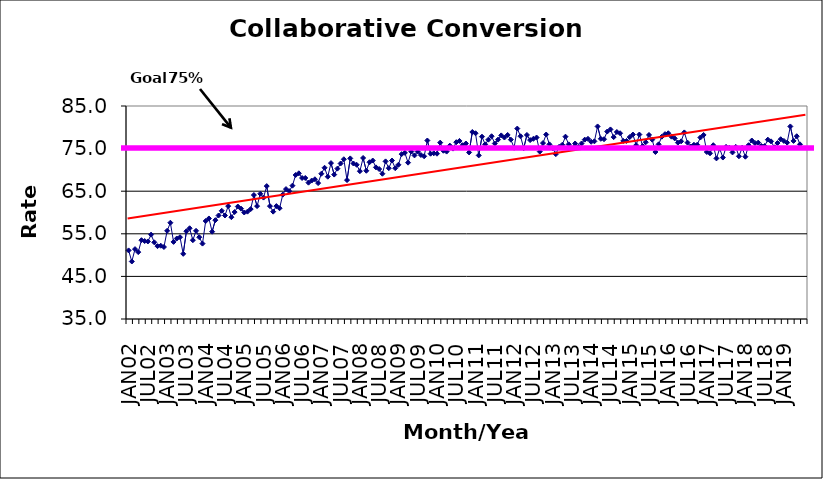
| Category | Series 0 |
|---|---|
| JAN02 | 51.1 |
| FEB02 | 48.5 |
| MAR02 | 51.4 |
| APR02 | 50.7 |
| MAY02 | 53.5 |
| JUN02 | 53.3 |
| JUL02 | 53.2 |
| AUG02 | 54.8 |
| SEP02 | 53 |
| OCT02 | 52.1 |
| NOV02 | 52.2 |
| DEC02 | 51.9 |
| JAN03 | 55.7 |
| FEB03 | 57.6 |
| MAR03 | 53.1 |
| APR03 | 53.9 |
| MAY03 | 54.2 |
| JUN03 | 50.3 |
| JUL03 | 55.6 |
| AUG03 | 56.3 |
| SEP03 | 53.5 |
| OCT03 | 55.7 |
| NOV03 | 54.2 |
| DEC03 | 52.7 |
| JAN04 | 58 |
| FEB04 | 58.6 |
| MAR04 | 55.5 |
| APR04 | 58.2 |
| MAY04 | 59.3 |
| JUN04 | 60.4 |
| JUL04 | 59.3 |
| AUG04 | 61.5 |
| SEP04 | 58.9 |
| OCT04 | 60.1 |
| NOV04 | 61.4 |
| DEC04 | 60.9 |
| JAN05 | 60 |
| FEB05 | 60.2 |
| MAR05 | 60.8 |
| APR05 | 64.1 |
| MAY05 | 61.5 |
| JUN05 | 64.4 |
| JUL05 | 63.5 |
| AUG05 | 66.2 |
| SEP05 | 61.5 |
| OCT05 | 60.2 |
| NOV05 | 61.5 |
| DEC05 | 61 |
| JAN06 | 64.2 |
| FEB06 | 65.5 |
| MAR06 | 65 |
| APR06 | 66.3 |
| MAY06 | 68.8 |
| JUN06 | 69.2 |
| JUL06 | 68.1 |
| AUG06 | 68.1 |
| SEP06 | 67 |
| OCT06 | 67.5 |
| NOV06 | 67.8 |
| DEC06 | 66.9 |
| JAN07 | 69.1 |
| FEB07 | 70.5 |
| MAR07 | 68.4 |
| APR07 | 71.6 |
| MAY07 | 68.9 |
| JUN07 | 70.3 |
| JUL07 | 71.5 |
| AUG07 | 72.5 |
| SEP07 | 67.6 |
| OCT07 | 72.7 |
| NOV07 | 71.5 |
| DEC07 | 71.2 |
| JAN08 | 69.7 |
| FEB08 | 72.8 |
| MAR08 | 69.8 |
| APR08 | 71.8 |
| MAY08 | 72.2 |
| JUN08 | 70.6 |
| JUL08 | 70.2 |
| AUG08 | 69.1 |
| SEP08 | 72 |
| OCT08 | 70.4 |
| NOV08 | 72.2 |
| DEC08 | 70.4 |
| JAN09 | 71.2 |
| FEB09 | 73.7 |
| MAR09 | 74 |
| APR09 | 71.7 |
| MAY09 | 74.3 |
| JUN09 | 73.4 |
| JUL09 | 74.3 |
| AUG09 | 73.5 |
| SEP09 | 73.2 |
| OCT09 | 76.9 |
| NOV09 | 73.8 |
| DEC09 | 73.9 |
| JAN10 | 73.8 |
| FEB10 | 76.4 |
| MAR10 | 74.5 |
| APR10 | 74.3 |
| MAY10 | 75.7 |
| JUN10 | 75 |
| JUL10 | 76.5 |
| AUG10 | 76.8 |
| SEP10 | 75.8 |
| OCT10 | 76.2 |
| NOV10 | 74.1 |
| DEC10 | 78.9 |
| JAN11 | 78.6 |
| FEB11 | 73.4 |
| MAR11 | 77.8 |
| APR11 | 76 |
| MAY11 | 77.1 |
| JUN11 | 77.9 |
| JUL11 | 76.2 |
| AUG11 | 77.1 |
| SEP11 | 78.1 |
| OCT11 | 77.6 |
| NOV11 | 78.2 |
| DEC11 | 77.1 |
| JAN12 | 75.2 |
| FEB12 | 79.7 |
| MAR12 | 77.9 |
| APR12 | 75.1 |
| MAY12 | 78.2 |
| JUN12 | 77 |
| JUL12 | 77.3 |
| AUG12 | 77.6 |
| SEP12 | 74.3 |
| OCT12 | 76.3 |
| NOV12 | 78.3 |
| DEC12 | 76 |
| JAN13 | 75.1 |
| FEB13 | 73.7 |
| MAR13 | 75.4 |
| APR13 | 75.9 |
| MAY13 | 77.8 |
| JUN13 | 76 |
| JUL13 | 75.1 |
| AUG13 | 76.2 |
| SEP13 | 75.4 |
| OCT13 | 76.2 |
| NOV13 | 77.1 |
| DEC13 | 77.3 |
| JAN14 | 76.6 |
| FEB14 | 76.7 |
| MAR14 | 80.2 |
| APR14 | 77.3 |
| MAY14 | 77.2 |
| JUN14 | 79 |
| JUL14 | 79.5 |
| AUG14 | 77.7 |
| SEP14 | 78.9 |
| OCT14 | 78.6 |
| NOV14 | 76.8 |
| DEC14 | 76.8 |
| JAN15 | 77.7 |
| FEB15 | 78.3 |
| MAR15 | 75.8 |
| APR15 | 78.3 |
| MAY15 | 75.6 |
| JUN15 | 76.5 |
| JUL15 | 78.2 |
| AUG15 | 77.1 |
| SEP15 | 74.2 |
| OCT15 | 76 |
| NOV15 | 77.8 |
| DEC15 | 78.4 |
| JAN16 | 78.6 |
| FEB16 | 77.8 |
| MAR16 | 77.4 |
| APR16 | 76.4 |
| MAY16 | 76.7 |
| JUN16 | 78.8 |
| JUL16 | 76.4 |
| AUG16 | 75.5 |
| SEP16 | 75.9 |
| OCT16 | 75.9 |
| NOV16 | 77.6 |
| DEC16 | 78.2 |
| JAN17 | 74.2 |
| FEB17 | 73.9 |
| MAR17 | 75.8 |
| APR17 | 72.7 |
| MAY17 | 75 |
| JUN17 | 72.9 |
| JUL17 | 75.4 |
| AUG17 | 75.2 |
| SEP17 | 74.1 |
| OCT17 | 75.4 |
| NOV17 | 73.2 |
| DEC17 | 75.2 |
| JAN18 | 73.1 |
| FEB18 | 75.8 |
| MAR18 | 76.9 |
| APR18 | 76.3 |
| MAY18 | 76.4 |
| JUN18 | 75.6 |
| JUL18 | 75.6 |
| AUG18 | 77.1 |
| SEP18 | 76.7 |
| OCT18 | 75.3 |
| NOV18 | 76.3 |
| DEC18 | 77.2 |
| JAN19 | 76.8 |
| FEB19 | 76.4 |
| MAR19 | 80.2 |
| APR19 | 76.8 |
| MAY19 | 77.9 |
| JUN19 | 76 |